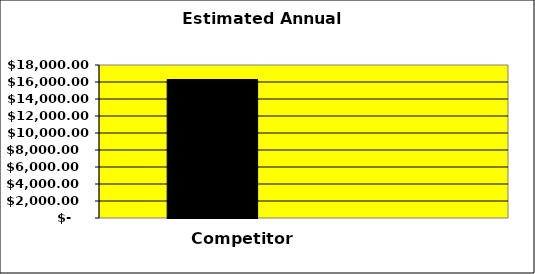
| Category | Series 0 | Series 1 | Series 2 |
|---|---|---|---|
| 0 | 16289 |  | 0 |